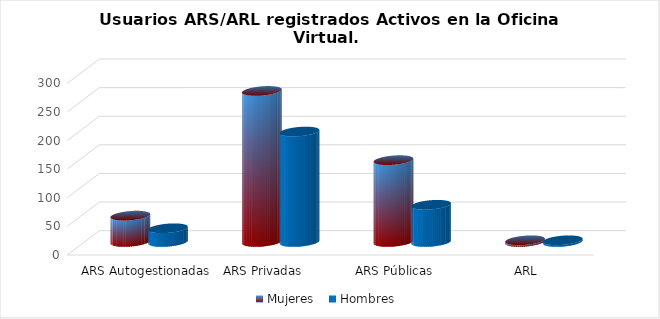
| Category | Mujeres | Hombres |
|---|---|---|
| ARS Autogestionadas | 46 | 24 |
| ARS Privadas | 264 | 193 |
| ARS Públicas | 143 | 65 |
| ARL | 3 | 3 |